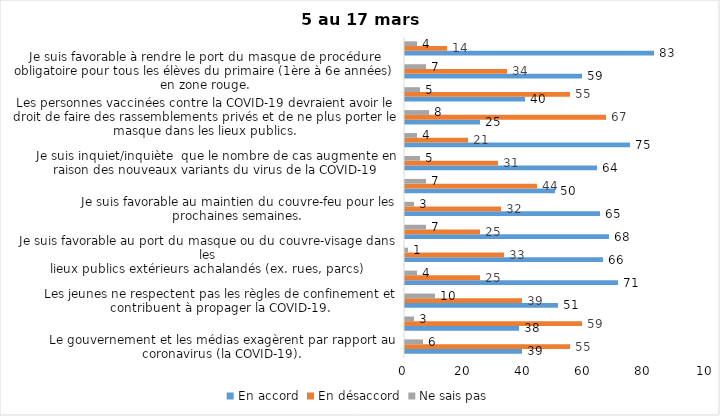
| Category | En accord | En désaccord | Ne sais pas |
|---|---|---|---|
| Le gouvernement et les médias exagèrent par rapport au coronavirus (la COVID-19). | 39 | 55 | 6 |
| Il est exagéré de rester chez soi pour se protéger contre le coronavirus (la COVID-19). | 38 | 59 | 3 |
| Les jeunes ne respectent pas les règles de confinement et contribuent à propager la COVID-19. | 51 | 39 | 10 |
| C’est une bonne chose que les policiers puissent donner facilement des contraventions aux gens qui ne respectent pas les mesures pour prévenir le coronavirus (la COVID-19). | 71 | 25 | 4 |
| Je suis favorable au port du masque ou du couvre-visage dans les
lieux publics extérieurs achalandés (ex. rues, parcs) | 66 | 33 | 1 |
| Les activités extérieures en petits groupes sont sécuritaires pour éviter la propagation de la COVID-19. | 68 | 25 | 7 |
| Je suis favorable au maintien du couvre-feu pour les prochaines semaines. | 65 | 32 | 3 |
| J’ai peur que le système de santé soit débordé par les cas de COVID-19 suite à l’assouplissement des mesures | 50 | 44 | 7 |
| Je suis inquiet/inquiète  que le nombre de cas augmente en raison des nouveaux variants du virus de la COVID-19 | 64 | 31 | 5 |
| La frontière entre le Canada et les États-Unis devrait être fermée au moins jusqu’en septembre 2021 | 75 | 21 | 4 |
| Les personnes vaccinées contre la COVID-19 devraient avoir le droit de faire des rassemblements privés et de ne plus porter le masque dans les lieux publics. | 25 | 67 | 8 |
| Je crois que le gouvernement a implanté trop de mesures par rapport à ce que la santé publique recommandait (ex. : fermeture des restaurants). | 40 | 55 | 5 |
| Je suis favorable à rendre le port du masque de procédure obligatoire pour tous les élèves du primaire (1ère à 6e années) en zone rouge. | 59 | 34 | 7 |
| Pour éviter la propagation de la COVID-19, c’est une bonne chose que le gouvernement maintiennent des mesures préventives plus strictes pour les régions entourant Montréal. | 83 | 14 | 4 |